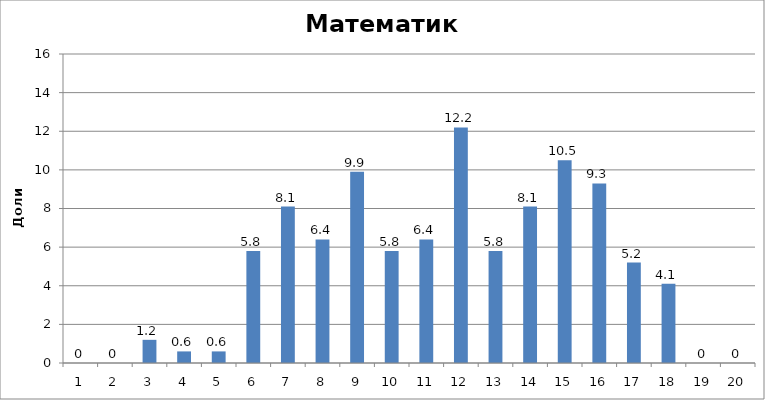
| Category | МБОУ СОШ № 42 |
|---|---|
| 0 | 0 |
| 1 | 0 |
| 2 | 1.2 |
| 3 | 0.6 |
| 4 | 0.6 |
| 5 | 5.8 |
| 6 | 8.1 |
| 7 | 6.4 |
| 8 | 9.9 |
| 9 | 5.8 |
| 10 | 6.4 |
| 11 | 12.2 |
| 12 | 5.8 |
| 13 | 8.1 |
| 14 | 10.5 |
| 15 | 9.3 |
| 16 | 5.2 |
| 17 | 4.1 |
| 18 | 0 |
| 19 | 0 |